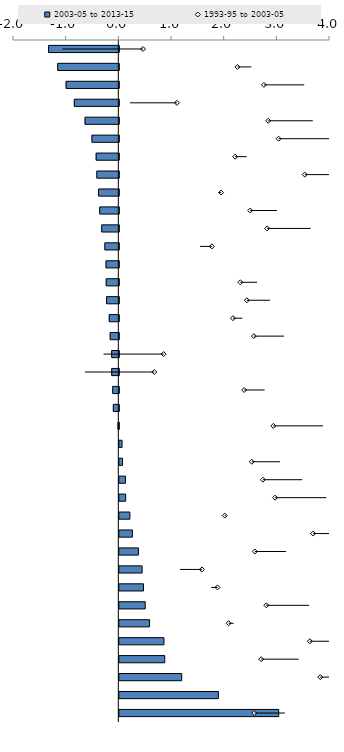
| Category | 2003-05 to 2013-15 |
|---|---|
| 1.53184870477203 | -1.333 |
| -0.262134584759033 | -1.16 |
| -0.764756863862603 | -1.001 |
| 0.888469067143016 | -0.845 |
| -0.846129996385014 | -0.641 |
| -1.04401173487476 | -0.511 |
| -0.218130047675347 | -0.43 |
| -1.54026831849947 | -0.417 |
| 0.0497323831152308 | -0.386 |
| -0.504836644195317 | -0.363 |
| -0.825480268524048 | -0.325 |
| 0.223965342202481 | -0.265 |
| -3.0550435898393 | -0.242 |
| -0.316462395260175 | -0.24 |
| -0.440100857432513 | -0.233 |
| -0.17709882086292 | -0.182 |
| -0.57265547669807 | -0.164 |
| 1.14023496863749 | -0.136 |
| 1.31713609124822 | -0.136 |
| -0.388973220674183 | -0.116 |
| -2.70858731727976 | -0.104 |
| -0.942736638582564 | -0.016 |
| -2.16912002746662 | 0.052 |
| -0.534127009427177 | 0.06 |
| -0.745257175984992 | 0.116 |
| -0.975308867134295 | 0.12 |
| -0.0209814867489277 | 0.201 |
| -1.69947945858134 | 0.248 |
| -0.591894012077288 | 0.363 |
| 0.413410770943257 | 0.433 |
| 0.117087265786009 | 0.459 |
| -0.811048139520743 | 0.492 |
| -0.0942846410355913 | 0.574 |
| -1.63578215679479 | 0.847 |
| -0.712697539783758 | 0.862 |
| -1.83408683047651 | 1.184 |
| -2.9229918706444 | 1.881 |
| -0.580958095063777 | 3.026 |